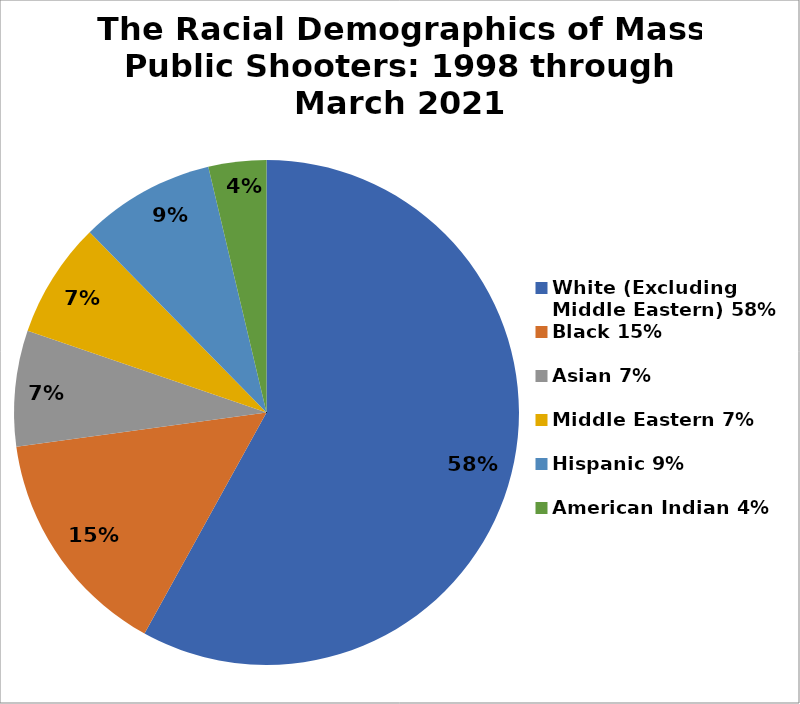
| Category | Series 0 |
|---|---|
| White (Excluding Middle Eastern) 58% | 0.58 |
| Black 15% | 0.148 |
| Asian 7% | 0.074 |
| Middle Eastern 7% | 0.074 |
| Hispanic 9% | 0.086 |
| American Indian 4% | 0.037 |